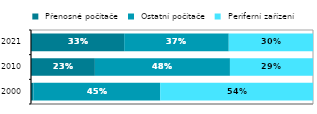
| Category |  Přenosné počítače |  Ostatní počítače |  Periferní zařízení |
|---|---|---|---|
| 2000.0 | 0.009 | 0.449 | 0.542 |
| 2010.0 | 0.227 | 0.479 | 0.295 |
| 2021.0 | 0.33 | 0.371 | 0.299 |